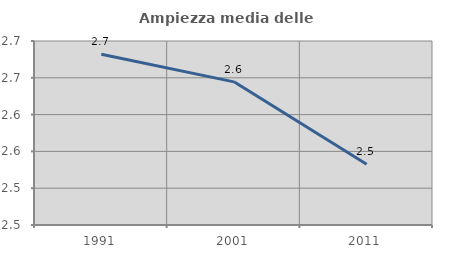
| Category | Ampiezza media delle famiglie |
|---|---|
| 1991.0 | 2.682 |
| 2001.0 | 2.644 |
| 2011.0 | 2.533 |